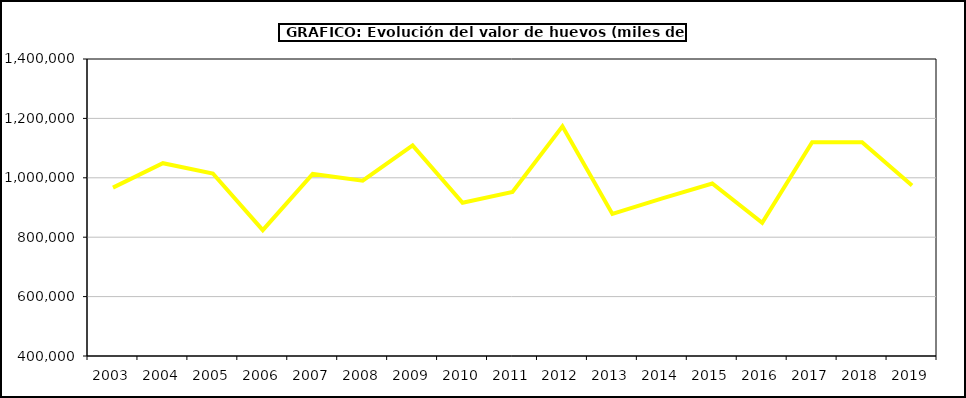
| Category | huevos |
|---|---|
| 2003.0 | 966991.3 |
| 2004.0 | 1049094.98 |
| 2005.0 | 1014518.979 |
| 2006.0 | 823874.691 |
| 2007.0 | 1012879.578 |
| 2008.0 | 990180.415 |
| 2009.0 | 1109356.704 |
| 2010.0 | 915832.84 |
| 2011.0 | 952462.311 |
| 2012.0 | 1173176.818 |
| 2013.0 | 878243.026 |
| 2014.0 | 930912.202 |
| 2015.0 | 980944.68 |
| 2016.0 | 848224 |
| 2017.0 | 1119773.503 |
| 2018.0 | 1119711.329 |
| 2019.0 | 974085.433 |